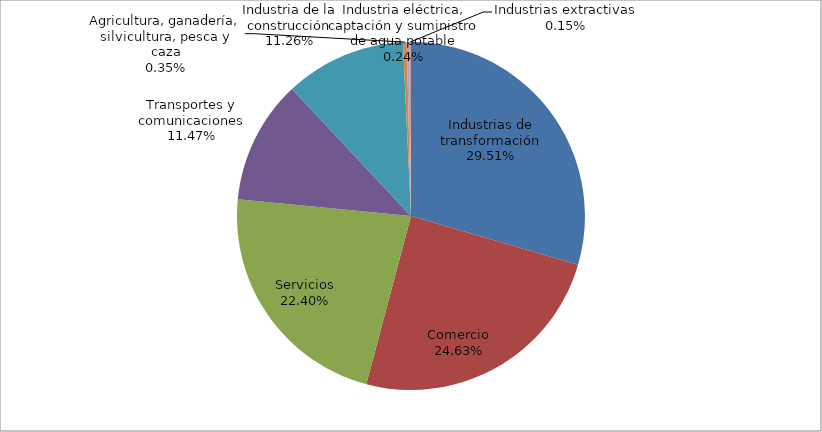
| Category | Series 0 |
|---|---|
| Industrias de transformación | 30631 |
| Comercio | 25562 |
| Servicios | 23254 |
| Transportes y comunicaciones | 11904 |
| Industria de la construcción | 11684 |
| Agricultura, ganadería, silvicultura, pesca y caza | 357 |
| Industria eléctrica, captación y suministro de agua potable | 250 |
| Industrias extractivas | 158 |